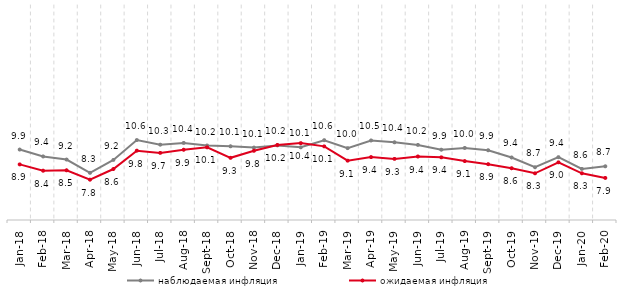
| Category | наблюдаемая инфляция | ожидаемая инфляция |
|---|---|---|
| 2018-01-01 | 9.916 | 8.879 |
| 2018-02-01 | 9.433 | 8.44 |
| 2018-03-01 | 9.218 | 8.469 |
| 2018-04-01 | 8.292 | 7.814 |
| 2018-05-01 | 9.192 | 8.556 |
| 2018-06-01 | 10.578 | 9.837 |
| 2018-07-01 | 10.255 | 9.682 |
| 2018-08-01 | 10.378 | 9.901 |
| 2018-09-01 | 10.196 | 10.07 |
| 2018-10-01 | 10.143 | 9.339 |
| 2018-11-01 | 10.053 | 9.831 |
| 2018-12-01 | 10.205 | 10.236 |
| 2019-01-01 | 10.071 | 10.363 |
| 2019-02-01 | 10.567 | 10.136 |
| 2019-03-01 | 10.013 | 9.141 |
| 2019-04-01 | 10.548 | 9.39 |
| 2019-05-01 | 10.421 | 9.264 |
| 2019-06-01 | 10.239 | 9.429 |
| 2019-07-01 | 9.904 | 9.371 |
| 2019-08-01 | 10.027 | 9.11 |
| 2019-09-01 | 9.867 | 8.894 |
| 2019-10-01 | 9.362 | 8.612 |
| 2019-11-01 | 8.68 | 8.257 |
| 2019-12-01 | 9.383 | 9.022 |
| 2020-01-01 | 8.566 | 8.259 |
| 2020-02-01 | 8.747 | 7.934 |